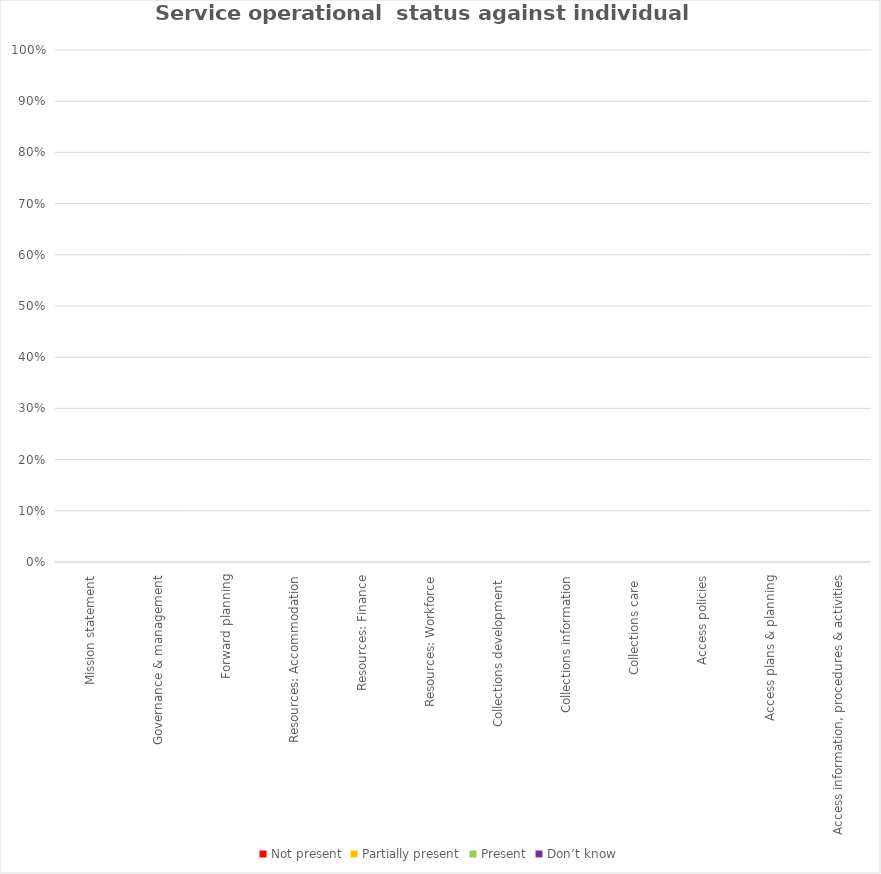
| Category | Not present | Partially present | Present | Don’t know |
|---|---|---|---|---|
| Mission statement | 0 | 0 | 0 | 0 |
| Governance & management | 0 | 0 | 0 | 0 |
| Forward planning | 0 | 0 | 0 | 0 |
| Resources: Accommodation | 0 | 0 | 0 | 0 |
| Resources: Finance | 0 | 0 | 0 | 0 |
| Resources: Workforce | 0 | 0 | 0 | 0 |
| Collections development  | 0 | 0 | 0 | 0 |
| Collections information | 0 | 0 | 0 | 0 |
| Collections care  | 0 | 0 | 0 | 0 |
| Access policies | 0 | 0 | 0 | 0 |
| Access plans & planning | 0 | 0 | 0 | 0 |
| Access information, procedures & activities | 0 | 0 | 0 | 0 |